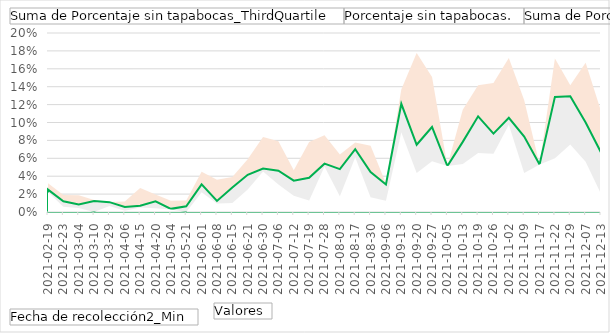
| Category | Suma de Porcentaje sin tapabocas_ThirdQuartile | Porcentaje sin tapabocas. | Suma de Porcentaje sin tapabocas_FirstQuartile |
|---|---|---|---|
| 2021-02-19 | 0.032 | 0.025 | 0.022 |
| 2021-02-23 | 0.019 | 0.012 | 0.006 |
| 2021-03-04 | 0.019 | 0.008 | 0.004 |
| 2021-03-10 | 0.014 | 0.012 | 0 |
| 2021-03-29 | 0.011 | 0.011 | 0.007 |
| 2021-04-06 | 0.012 | 0.006 | 0.001 |
| 2021-04-15 | 0.027 | 0.007 | 0.005 |
| 2021-04-20 | 0.02 | 0.012 | 0.004 |
| 2021-05-04 | 0.013 | 0.004 | 0.003 |
| 2021-05-21 | 0.013 | 0.006 | 0 |
| 2021-06-01 | 0.045 | 0.031 | 0.022 |
| 2021-06-08 | 0.036 | 0.012 | 0.01 |
| 2021-06-15 | 0.039 | 0.027 | 0.01 |
| 2021-06-21 | 0.059 | 0.042 | 0.025 |
| 2021-06-30 | 0.084 | 0.049 | 0.045 |
| 2021-07-06 | 0.079 | 0.046 | 0.031 |
| 2021-07-12 | 0.047 | 0.035 | 0.018 |
| 2021-07-19 | 0.078 | 0.038 | 0.013 |
| 2021-07-28 | 0.086 | 0.054 | 0.051 |
| 2021-08-03 | 0.064 | 0.048 | 0.017 |
| 2021-08-17 | 0.078 | 0.07 | 0.061 |
| 2021-08-30 | 0.074 | 0.045 | 0.016 |
| 2021-09-06 | 0.032 | 0.031 | 0.013 |
| 2021-09-13 | 0.137 | 0.121 | 0.089 |
| 2021-09-20 | 0.178 | 0.075 | 0.043 |
| 2021-09-27 | 0.151 | 0.095 | 0.057 |
| 2021-10-05 | 0.051 | 0.051 | 0.051 |
| 2021-10-13 | 0.114 | 0.078 | 0.054 |
| 2021-10-19 | 0.142 | 0.107 | 0.066 |
| 2021-10-26 | 0.144 | 0.088 | 0.065 |
| 2021-11-02 | 0.172 | 0.105 | 0.098 |
| 2021-11-09 | 0.125 | 0.084 | 0.043 |
| 2021-11-17 | 0.053 | 0.053 | 0.053 |
| 2021-11-22 | 0.171 | 0.129 | 0.06 |
| 2021-11-29 | 0.142 | 0.129 | 0.075 |
| 2021-12-07 | 0.167 | 0.1 | 0.056 |
| 2021-12-13 | 0.113 | 0.067 | 0.02 |